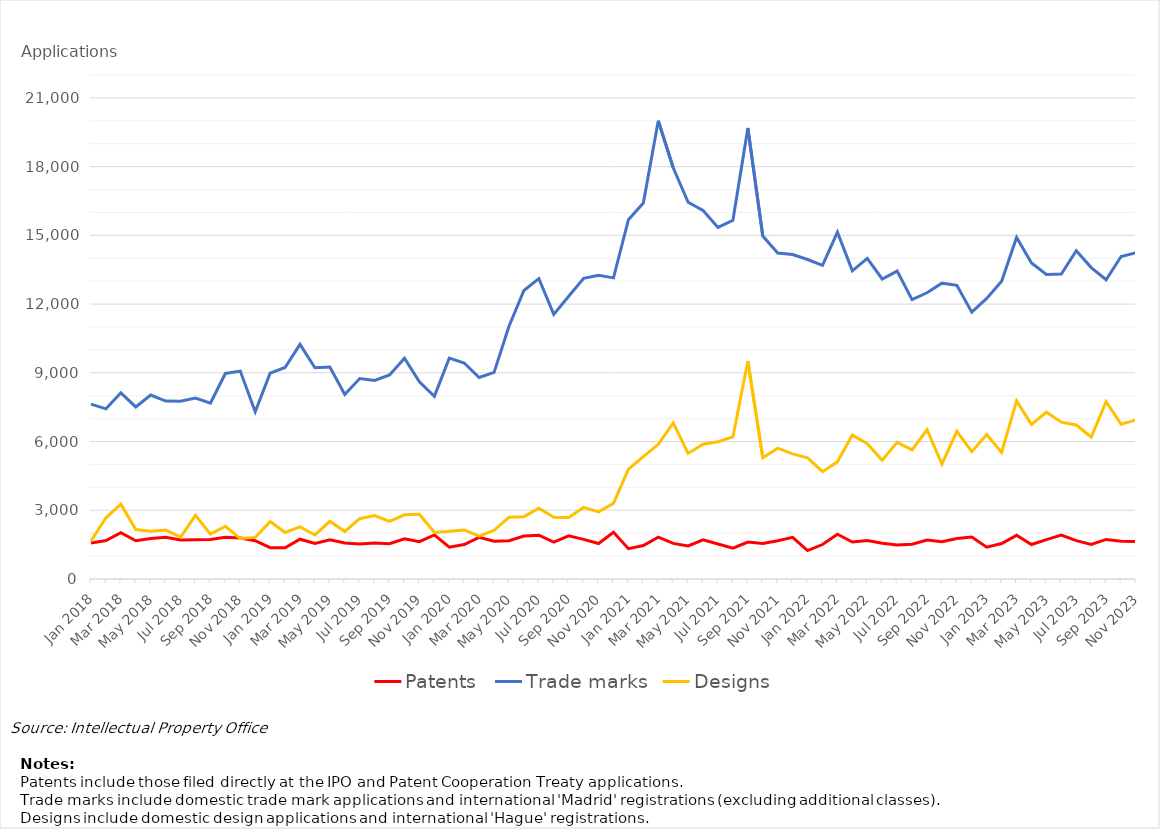
| Category | Patents | Trade marks | Designs |
|---|---|---|---|
| Jan 2018 | 1575 | 7634 | 1658 |
| Feb 2018 | 1676 | 7428 | 2672 |
| Mar 2018 | 2022 | 8127 | 3267 |
| Apr 2018 | 1670 | 7512 | 2160 |
| May 2018 | 1767 | 8030 | 2083 |
| Jun 2018 | 1821 | 7769 | 2136 |
| Jul 2018 | 1704 | 7757 | 1832 |
| Aug 2018 | 1713 | 7897 | 2777 |
| Sep 2018 | 1725 | 7673 | 1960 |
| Oct 2018 | 1818 | 8972 | 2302 |
| Nov 2018 | 1787 | 9076 | 1765 |
| Dec 2018 | 1670 | 7304 | 1815 |
| Jan 2019 | 1367 | 8985 | 2505 |
| Feb 2019 | 1361 | 9234 | 2031 |
| Mar 2019 | 1737 | 10243 | 2274 |
| Apr 2019 | 1552 | 9219 | 1923 |
| May 2019 | 1710 | 9251 | 2520 |
| Jun 2019 | 1569 | 8053 | 2074 |
| Jul 2019 | 1527 | 8752 | 2634 |
| Aug 2019 | 1571 | 8670 | 2768 |
| Sep 2019 | 1540 | 8908 | 2511 |
| Oct 2019 | 1755 | 9636 | 2800 |
| Nov 2019 | 1630 | 8607 | 2827 |
| Dec 2019 | 1926 | 7970 | 2028 |
| Jan 2020 | 1391 | 9642 | 2082 |
| Feb 2020 | 1504 | 9428 | 2143 |
| Mar 2020 | 1819 | 8794 | 1872 |
| Apr 2020 | 1648 | 9021 | 2127 |
| May 2020 | 1672 | 11035 | 2695 |
| Jun 2020 | 1879 | 12593 | 2721 |
| Jul 2020 | 1912 | 13110 | 3086 |
| Aug 2020 | 1613 | 11551 | 2695 |
| Sep 2020 | 1886 | 12340 | 2686 |
| Oct 2020 | 1730 | 13126 | 3124 |
| Nov 2020 | 1547 | 13254 | 2930 |
| Dec 2020 | 2042 | 13144 | 3302 |
| Jan 2021 | 1324 | 15685 | 4792 |
| Feb 2021 | 1462 | 16413 | 5340 |
| Mar 2021 | 1828 | 20001 | 5878 |
| Apr 2021 | 1554 | 17951 | 6815 |
| May 2021 | 1446 | 16446 | 5480 |
| Jun 2021 | 1712 | 16090 | 5881 |
| Jul 2021 | 1528 | 15347 | 5989 |
| Aug 2021 | 1344 | 15659 | 6200 |
| Sep 2021 | 1615 | 19685 | 9517 |
| Oct 2021 | 1547 | 14968 | 5292 |
| Nov 2021 | 1670 | 14232 | 5712 |
| Dec 2021 | 1817 | 14162 | 5464 |
| Jan 2022 | 1240 | 13945 | 5288 |
| Feb 2022 | 1505 | 13690 | 4683 |
| Mar 2022 | 1952 | 15142 | 5114 |
| Apr 2022 | 1616 | 13450 | 6282 |
| May 2022 | 1683 | 13992 | 5907 |
| Jun 2022 | 1561 | 13096 | 5183 |
| Jul 2022 | 1483 | 13439 | 5963 |
| Aug 2022 | 1520 | 12197 | 5639 |
| Sep 2022 | 1702 | 12493 | 6515 |
| Oct 2022 | 1629 | 12914 | 5013 |
| Nov 2022 | 1770 | 12819 | 6447 |
| Dec 2022 | 1828 | 11650 | 5558 |
| Jan 2023 | 1390 | 12250 | 6307 |
| Feb 2023 | 1550 | 13001 | 5528 |
| Mar 2023 | 1907 | 14909 | 7775 |
| Apr 2023 | 1505 | 13791 | 6744 |
| May 2023 | 1717 | 13292 | 7281 |
| Jun 2023 | 1920 | 13316 | 6845 |
| Jul 2023 | 1675 | 14328 | 6721 |
| Aug 2023 | 1511 | 13594 | 6199 |
| Sep 2023 | 1728 | 13065 | 7741 |
| Oct 2023 | 1644 | 14078 | 6757 |
| Nov 2023 | 1639 | 14243 | 6941 |